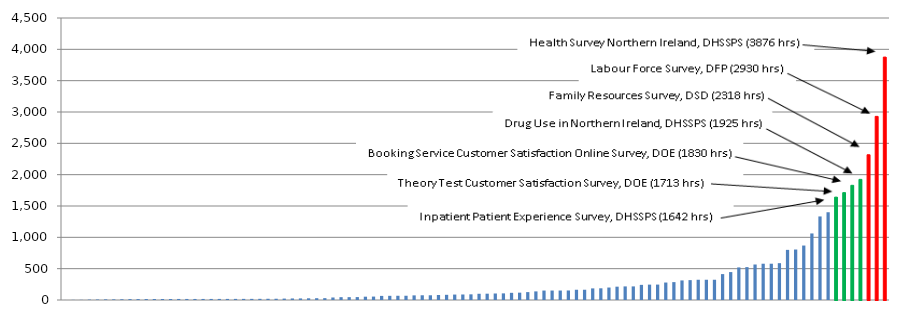
| Category | Series 0 |
|---|---|
| 0 | 0.633 |
| 1 | 2.333 |
| 2 | 2.733 |
| 3 | 6.6 |
| 4 | 8.167 |
| 5 | 10.3 |
| 6 | 10.333 |
| 7 | 11.633 |
| 8 | 14.333 |
| 9 | 14.5 |
| 10 | 15.5 |
| 11 | 15.633 |
| 12 | 15.833 |
| 13 | 16 |
| 14 | 16.667 |
| 15 | 16.667 |
| 16 | 16.667 |
| 17 | 16.833 |
| 18 | 17 |
| 19 | 17.167 |
| 20 | 17.333 |
| 21 | 17.667 |
| 22 | 17.833 |
| 23 | 18 |
| 24 | 18.667 |
| 25 | 19.5 |
| 26 | 20 |
| 27 | 22.5 |
| 28 | 24.546 |
| 29 | 25.173 |
| 30 | 27.17 |
| 31 | 28.833 |
| 32 | 29.667 |
| 33 | 40 |
| 34 | 45.211 |
| 35 | 45.6 |
| 36 | 46.667 |
| 37 | 53 |
| 38 | 54.583 |
| 39 | 65.456 |
| 40 | 66.75 |
| 41 | 67.6 |
| 42 | 67.926 |
| 43 | 73.833 |
| 44 | 75.503 |
| 45 | 75.503 |
| 46 | 80 |
| 47 | 82.833 |
| 48 | 86.8 |
| 49 | 88 |
| 50 | 90.423 |
| 51 | 99.465 |
| 52 | 100.691 |
| 53 | 103.833 |
| 54 | 105.704 |
| 55 | 114.548 |
| 56 | 117.267 |
| 57 | 125.864 |
| 58 | 137.417 |
| 59 | 150.833 |
| 60 | 151.037 |
| 61 | 151.037 |
| 62 | 152.133 |
| 63 | 163.639 |
| 64 | 163.639 |
| 65 | 185.25 |
| 66 | 186.667 |
| 67 | 198.988 |
| 68 | 212.731 |
| 69 | 216.967 |
| 70 | 216.967 |
| 71 | 241.61 |
| 72 | 245.459 |
| 73 | 246 |
| 74 | 278.667 |
| 75 | 285.29 |
| 76 | 312.461 |
| 77 | 317.113 |
| 78 | 323.167 |
| 79 | 323.167 |
| 80 | 323.167 |
| 81 | 413.233 |
| 82 | 445.6 |
| 83 | 520 |
| 84 | 525 |
| 85 | 566.467 |
| 86 | 578.975 |
| 87 | 578.975 |
| 88 | 587.747 |
| 89 | 800 |
| 90 | 805.531 |
| 91 | 869 |
| 92 | 1062 |
| 93 | 1333.333 |
| 94 | 1400.3 |
| 95 | 1641.6 |
| 96 | 1713.083 |
| 97 | 1830.1 |
| 98 | 1925.1 |
| 99 | 2317.767 |
| 100 | 2930.25 |
| 101 | 3876.117 |